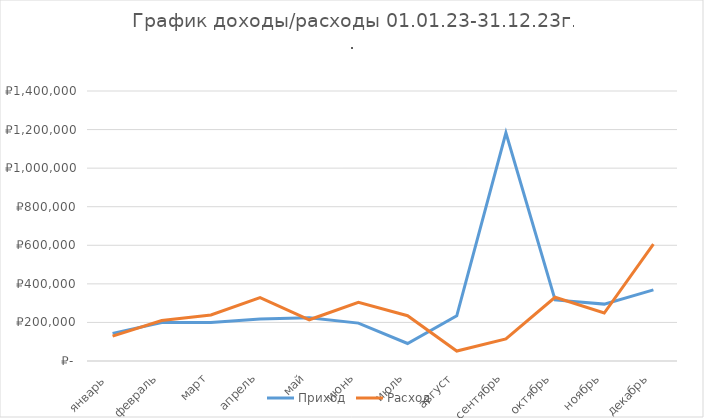
| Category | Приход | Расход |
|---|---|---|
| январь  | 143420 | 128945 |
| февраль | 199966 | 210043 |
| март | 200266 | 238912 |
| апрель | 217316 | 329169 |
| май | 224466 | 213749 |
| июнь | 196480 | 303919 |
| июль | 90700 | 234656 |
| август | 234500 | 51455 |
| сентябрь | 1183100 | 114855 |
| октябрь | 316600 | 330494 |
| ноябрь | 295000 | 248740 |
| декабрь | 369000 | 606338 |